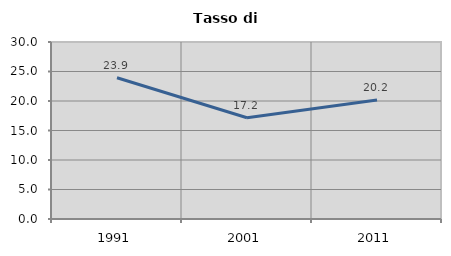
| Category | Tasso di disoccupazione   |
|---|---|
| 1991.0 | 23.934 |
| 2001.0 | 17.165 |
| 2011.0 | 20.17 |